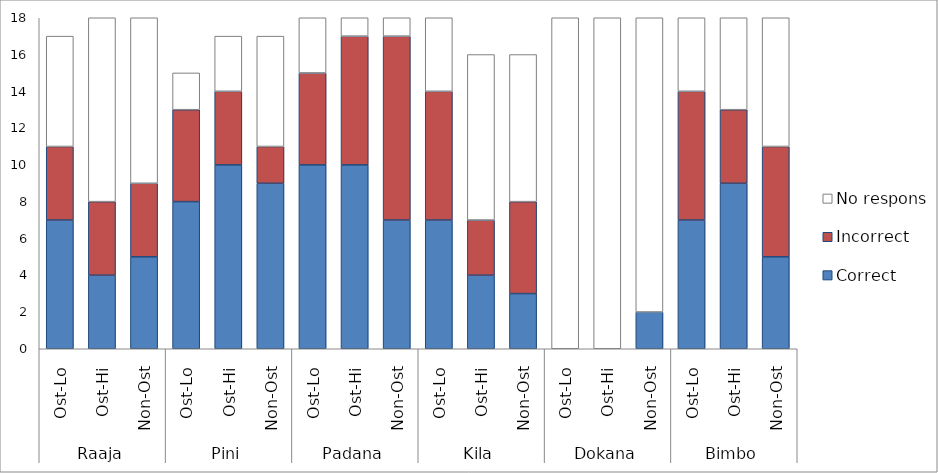
| Category | Correct | Incorrect | No response |
|---|---|---|---|
| 0 | 7 | 4 | 6 |
| 1 | 4 | 4 | 10 |
| 2 | 5 | 4 | 9 |
| 3 | 8 | 5 | 2 |
| 4 | 10 | 4 | 3 |
| 5 | 9 | 2 | 6 |
| 6 | 10 | 5 | 3 |
| 7 | 10 | 7 | 1 |
| 8 | 7 | 10 | 1 |
| 9 | 7 | 7 | 4 |
| 10 | 4 | 3 | 9 |
| 11 | 3 | 5 | 8 |
| 12 | 0 | 0 | 18 |
| 13 | 0 | 0 | 18 |
| 14 | 2 | 0 | 16 |
| 15 | 7 | 7 | 4 |
| 16 | 9 | 4 | 5 |
| 17 | 5 | 6 | 7 |